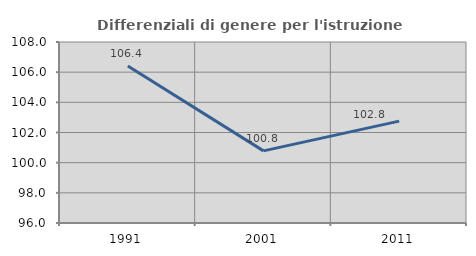
| Category | Differenziali di genere per l'istruzione superiore |
|---|---|
| 1991.0 | 106.41 |
| 2001.0 | 100.782 |
| 2011.0 | 102.755 |